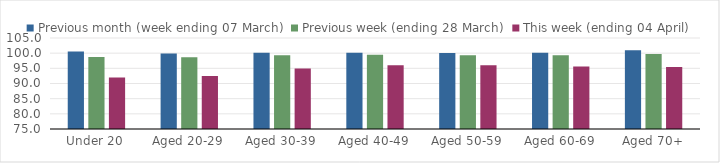
| Category | Previous month (week ending 07 March) | Previous week (ending 28 March) | This week (ending 04 April) |
|---|---|---|---|
| Under 20 | 100.56 | 98.768 | 91.937 |
| Aged 20-29 | 99.89 | 98.637 | 92.48 |
| Aged 30-39 | 100.14 | 99.336 | 94.948 |
| Aged 40-49 | 100.147 | 99.456 | 95.982 |
| Aged 50-59 | 100.077 | 99.35 | 96.039 |
| Aged 60-69 | 100.157 | 99.275 | 95.572 |
| Aged 70+ | 100.95 | 99.732 | 95.468 |